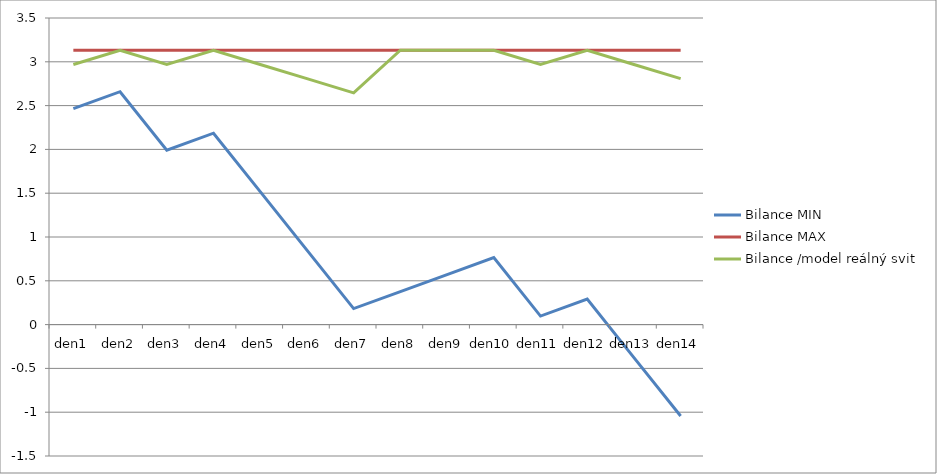
| Category | Bilance MIN | Bilance MAX | Bilance /model reálný svit |
|---|---|---|---|
| den1 | 2.465 | 3.132 | 2.97 |
| den2 | 2.659 | 3.132 | 3.132 |
| den3 | 1.991 | 3.132 | 2.97 |
| den4 | 2.185 | 3.132 | 3.132 |
| den5 | 1.518 | 3.132 | 2.97 |
| den6 | 0.85 | 3.132 | 2.807 |
| den7 | 0.183 | 3.132 | 2.645 |
| den8 | 0.377 | 3.132 | 3.132 |
| den9 | 0.571 | 3.132 | 3.132 |
| den10 | 0.765 | 3.132 | 3.132 |
| den11 | 0.097 | 3.132 | 2.97 |
| den12 | 0.291 | 3.132 | 3.132 |
| den13 | -0.376 | 3.132 | 2.97 |
| den14 | -1.044 | 3.132 | 2.807 |